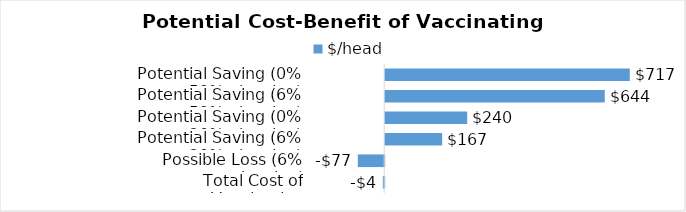
| Category | $/head |
|---|---|
| Total Cost of Vaccination | -4.03 |
| Possible Loss (6% abortion) | -77.38 |
| Potential Saving (6% vs. 20% abortion) | 167.12 |
| Potential Saving (0% vs. 20% abortion) | 240.47 |
| Potential Saving (6% vs. 59% abortion) | 643.895 |
| Potential Saving (0% vs. 59% abortion) | 717.245 |